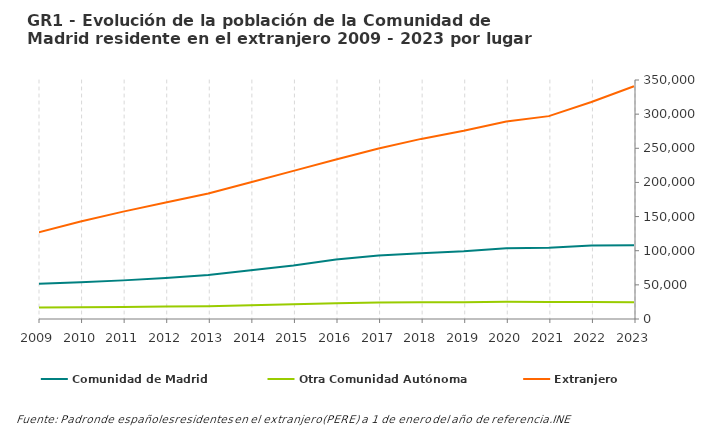
| Category | Comunidad de Madrid | Otra Comunidad Autónoma | Extranjero |
|---|---|---|---|
| 2023.0 | 108000 | 24387 | 340880 |
| 2022.0 | 107664 | 24962 | 317795 |
| 2021.0 | 104479 | 24896 | 297090 |
| 2020.0 | 103550 | 25234 | 289140 |
| 2019.0 | 99165 | 24564 | 275595 |
| 2018.0 | 96437 | 24443 | 263753 |
| 2017.0 | 92814 | 24119 | 249644 |
| 2016.0 | 87017 | 23122 | 233520 |
| 2015.0 | 78433 | 21470 | 216962 |
| 2014.0 | 71457 | 20114 | 200264 |
| 2013.0 | 64330 | 18826 | 183827 |
| 2012.0 | 59882 | 18178 | 170457 |
| 2011.0 | 56563 | 17483 | 157266 |
| 2010.0 | 53778 | 17112 | 142740 |
| 2009.0 | 51620 | 16891 | 126792 |